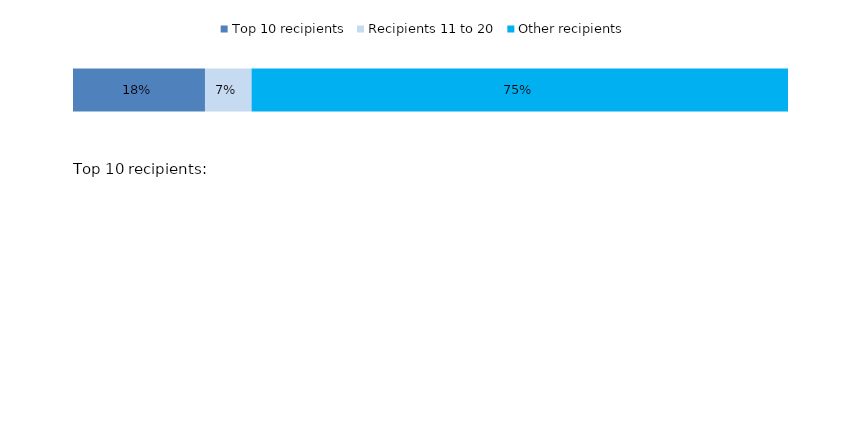
| Category | Top 10 recipients | Recipients 11 to 20 | Other recipients |
|---|---|---|---|
| 0 | 0.185 | 0.065 | 0.75 |